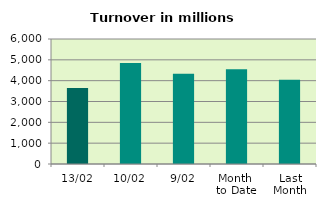
| Category | Series 0 |
|---|---|
| 13/02 | 3651.719 |
| 10/02 | 4845.379 |
| 9/02 | 4336.634 |
| Month 
to Date | 4544.37 |
| Last
Month | 4043.095 |